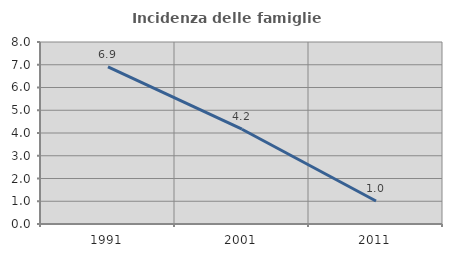
| Category | Incidenza delle famiglie numerose |
|---|---|
| 1991.0 | 6.911 |
| 2001.0 | 4.167 |
| 2011.0 | 1.01 |